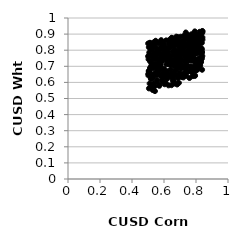
| Category | Series 0 |
|---|---|
| 0.789537141163253 | 0.861 |
| 0.7393209278989524 | 0.7 |
| 0.5146972384262045 | 0.762 |
| 0.8025821466182872 | 0.841 |
| 0.7553423103545773 | 0.827 |
| 0.6518374552992151 | 0.646 |
| 0.716653761533334 | 0.699 |
| 0.7913280189907017 | 0.906 |
| 0.5979593884945443 | 0.631 |
| 0.6924302068703907 | 0.749 |
| 0.6721062809417795 | 0.793 |
| 0.6343633907560136 | 0.862 |
| 0.7126194483507063 | 0.802 |
| 0.5954020792871302 | 0.768 |
| 0.7838053251334289 | 0.744 |
| 0.5831548302153797 | 0.768 |
| 0.6665365841519753 | 0.846 |
| 0.5408568572932027 | 0.755 |
| 0.7822607365205054 | 0.853 |
| 0.5972532858750963 | 0.798 |
| 0.5687135410672672 | 0.747 |
| 0.8086954234759687 | 0.823 |
| 0.6833786474103468 | 0.787 |
| 0.575823483311674 | 0.677 |
| 0.7512775900678096 | 0.874 |
| 0.5157013543859263 | 0.822 |
| 0.6257720732143637 | 0.787 |
| 0.6489855045192885 | 0.66 |
| 0.6496880024415178 | 0.652 |
| 0.643625241038317 | 0.766 |
| 0.8337201559222865 | 0.802 |
| 0.7409492055369735 | 0.871 |
| 0.6217054554742861 | 0.669 |
| 0.7963768174862137 | 0.865 |
| 0.7535535987557852 | 0.76 |
| 0.6586420130550489 | 0.625 |
| 0.807680028695077 | 0.882 |
| 0.7996050523855961 | 0.676 |
| 0.5791963725857388 | 0.709 |
| 0.7899514284050327 | 0.823 |
| 0.6170863241183342 | 0.794 |
| 0.696999464018413 | 0.757 |
| 0.8108554417359185 | 0.829 |
| 0.5592521472254736 | 0.788 |
| 0.673407103201527 | 0.756 |
| 0.6364854366401308 | 0.713 |
| 0.8019023742772847 | 0.889 |
| 0.7017172402778769 | 0.762 |
| 0.682590820111384 | 0.859 |
| 0.8255507794949901 | 0.718 |
| 0.7270235156668525 | 0.863 |
| 0.5835508032848437 | 0.729 |
| 0.5480344765651697 | 0.776 |
| 0.590976132361733 | 0.851 |
| 0.5080178996267478 | 0.785 |
| 0.5213319708328319 | 0.726 |
| 0.5585170846697625 | 0.807 |
| 0.727219435900885 | 0.771 |
| 0.8247338158405075 | 0.855 |
| 0.6407434502436964 | 0.816 |
| 0.7399629861713787 | 0.728 |
| 0.8203378696219645 | 0.845 |
| 0.5749204074095717 | 0.741 |
| 0.6471009726955761 | 0.583 |
| 0.5258403186809127 | 0.585 |
| 0.6884872854444603 | 0.834 |
| 0.7778725840772602 | 0.883 |
| 0.7719403527171453 | 0.762 |
| 0.7857166333493164 | 0.742 |
| 0.6579228734268394 | 0.634 |
| 0.7614068246514567 | 0.867 |
| 0.6230047715944955 | 0.636 |
| 0.7730864565297618 | 0.812 |
| 0.7591578467960547 | 0.627 |
| 0.6450855435140814 | 0.73 |
| 0.6286691533007386 | 0.748 |
| 0.747986817526133 | 0.739 |
| 0.7959635419356264 | 0.853 |
| 0.5195048153118826 | 0.7 |
| 0.5660370532559245 | 0.736 |
| 0.5093421625427896 | 0.669 |
| 0.7877308143223478 | 0.886 |
| 0.5674634064427115 | 0.797 |
| 0.5613703026136772 | 0.713 |
| 0.5719420304504657 | 0.845 |
| 0.5675779671727499 | 0.65 |
| 0.8322778754209412 | 0.883 |
| 0.5765796773158051 | 0.691 |
| 0.6253366417877969 | 0.749 |
| 0.7154265294037168 | 0.797 |
| 0.5016962133848333 | 0.653 |
| 0.7712719926138032 | 0.899 |
| 0.7572323442549609 | 0.764 |
| 0.8345911046278203 | 0.805 |
| 0.5860378547236758 | 0.777 |
| 0.8224486327946388 | 0.914 |
| 0.6418075506634328 | 0.681 |
| 0.724220812300675 | 0.775 |
| 0.6787454511188613 | 0.731 |
| 0.7333125306797498 | 0.74 |
| 0.5228472771427579 | 0.637 |
| 0.6760243627180262 | 0.794 |
| 0.543372627101915 | 0.546 |
| 0.7576616174536694 | 0.889 |
| 0.713827252726047 | 0.857 |
| 0.6300923187554525 | 0.84 |
| 0.7904861337532192 | 0.819 |
| 0.7247234132525657 | 0.783 |
| 0.6359512200970323 | 0.767 |
| 0.5555859263387691 | 0.605 |
| 0.6768518473513807 | 0.884 |
| 0.7632916115194517 | 0.77 |
| 0.8361713561107815 | 0.791 |
| 0.7186095118210329 | 0.839 |
| 0.7826198001580864 | 0.9 |
| 0.5738240237371401 | 0.771 |
| 0.522229076433828 | 0.579 |
| 0.7436753682812365 | 0.773 |
| 0.5694467603981398 | 0.711 |
| 0.5233217223801523 | 0.711 |
| 0.6055794496710558 | 0.795 |
| 0.8259875826886454 | 0.705 |
| 0.5546883763017978 | 0.799 |
| 0.6970743407092577 | 0.658 |
| 0.7566165155017609 | 0.797 |
| 0.7992659975486164 | 0.816 |
| 0.7196651382184569 | 0.817 |
| 0.8271957800808887 | 0.865 |
| 0.6426070367800769 | 0.647 |
| 0.6394822772287416 | 0.647 |
| 0.7626421155655152 | 0.694 |
| 0.734411382934531 | 0.823 |
| 0.5534244408105516 | 0.684 |
| 0.8281919239707146 | 0.726 |
| 0.7088443723876972 | 0.739 |
| 0.8199861684290868 | 0.743 |
| 0.6401429103923447 | 0.758 |
| 0.7025045353921959 | 0.821 |
| 0.746728014880554 | 0.896 |
| 0.7581663571935776 | 0.846 |
| 0.7507911358505414 | 0.862 |
| 0.6372755305705395 | 0.857 |
| 0.7173810607794494 | 0.701 |
| 0.7935086587236646 | 0.727 |
| 0.7149317985403314 | 0.812 |
| 0.6154269675054836 | 0.713 |
| 0.7361277163643768 | 0.91 |
| 0.6131144084233837 | 0.861 |
| 0.5302334103463762 | 0.646 |
| 0.6282488273001341 | 0.582 |
| 0.6099894606985351 | 0.768 |
| 0.5708010144974307 | 0.579 |
| 0.5125394888278862 | 0.69 |
| 0.7178824865773556 | 0.792 |
| 0.6449624632456418 | 0.638 |
| 0.677701555558522 | 0.79 |
| 0.7886346470031298 | 0.821 |
| 0.501015685375253 | 0.842 |
| 0.7659417452105861 | 0.866 |
| 0.8004567309422825 | 0.847 |
| 0.5043896243421815 | 0.671 |
| 0.7761600594016458 | 0.771 |
| 0.6982249758776872 | 0.695 |
| 0.7770443676625121 | 0.763 |
| 0.5823176648096522 | 0.862 |
| 0.5293232185321834 | 0.553 |
| 0.6623106509693579 | 0.605 |
| 0.8365377168351142 | 0.846 |
| 0.5500247197642468 | 0.643 |
| 0.8404298894487359 | 0.865 |
| 0.8302343059578688 | 0.746 |
| 0.7280562744120243 | 0.766 |
| 0.7052163806409246 | 0.847 |
| 0.5883584156752549 | 0.762 |
| 0.814812190026081 | 0.711 |
| 0.7849867627304555 | 0.852 |
| 0.5396863462382026 | 0.771 |
| 0.6609840372955875 | 0.659 |
| 0.7225769808817138 | 0.888 |
| 0.6615694642950851 | 0.742 |
| 0.7804333124404206 | 0.639 |
| 0.6707992627941833 | 0.843 |
| 0.5102409027126322 | 0.593 |
| 0.7690451302396976 | 0.889 |
| 0.7619484803774603 | 0.751 |
| 0.6378902395056195 | 0.826 |
| 0.5511583664545938 | 0.713 |
| 0.6271628713404449 | 0.816 |
| 0.7670833033895674 | 0.882 |
| 0.7300021073221883 | 0.761 |
| 0.6046075290501778 | 0.769 |
| 0.5702450708924186 | 0.584 |
| 0.5722356065049252 | 0.678 |
| 0.5134334107048619 | 0.73 |
| 0.5810489904550544 | 0.743 |
| 0.6384709155846835 | 0.636 |
| 0.6186296199921117 | 0.622 |
| 0.7832609581420303 | 0.672 |
| 0.7989352083779209 | 0.778 |
| 0.812688064621234 | 0.869 |
| 0.7650897692764829 | 0.697 |
| 0.6068793432318736 | 0.639 |
| 0.7498929052159753 | 0.864 |
| 0.6120349753517347 | 0.811 |
| 0.5169431667872195 | 0.802 |
| 0.5420872220308097 | 0.657 |
| 0.6235870093073029 | 0.741 |
| 0.5422605610858657 | 0.576 |
| 0.7260380441251993 | 0.887 |
| 0.7116958134653328 | 0.651 |
| 0.5077893646532936 | 0.665 |
| 0.767893875161042 | 0.677 |
| 0.650373331584239 | 0.876 |
| 0.598786939241255 | 0.821 |
| 0.695608895007974 | 0.801 |
| 0.82535017237486 | 0.864 |
| 0.5104788671468552 | 0.772 |
| 0.7320293709174297 | 0.755 |
| 0.6269588786217475 | 0.713 |
| 0.593083062892082 | 0.85 |
| 0.5350707556940748 | 0.593 |
| 0.6294453702593112 | 0.858 |
| 0.7040968136256662 | 0.747 |
| 0.6533779649164462 | 0.839 |
| 0.7942106823003154 | 0.641 |
| 0.811901963147115 | 0.873 |
| 0.7104740438861703 | 0.823 |
| 0.693133057427636 | 0.597 |
| 0.7921355056519706 | 0.642 |
| 0.6892237066591924 | 0.828 |
| 0.7004566094279603 | 0.701 |
| 0.5308072251341074 | 0.688 |
| 0.5878246704918391 | 0.616 |
| 0.7457421732222543 | 0.793 |
| 0.6875049544639892 | 0.627 |
| 0.6015842296174445 | 0.835 |
| 0.5610861855862372 | 0.654 |
| 0.5486175619525406 | 0.854 |
| 0.8307150512817066 | 0.883 |
| 0.7889646714209345 | 0.79 |
| 0.5898890208474401 | 0.816 |
| 0.7682190639148487 | 0.873 |
| 0.5206159518238059 | 0.811 |
| 0.5944197797454747 | 0.605 |
| 0.5769503188403247 | 0.643 |
| 0.5443798624577283 | 0.769 |
| 0.5387178807052888 | 0.715 |
| 0.6572891983003302 | 0.618 |
| 0.505137078765321 | 0.819 |
| 0.5024680753734336 | 0.643 |
| 0.7415167907407327 | 0.792 |
| 0.6914305278073793 | 0.633 |
| 0.534198398019456 | 0.819 |
| 0.6204361340329394 | 0.664 |
| 0.8288236153589748 | 0.752 |
| 0.7369203330463815 | 0.681 |
| 0.538099366126239 | 0.851 |
| 0.8011450774957143 | 0.716 |
| 0.8105242713615359 | 0.881 |
| 0.7292228330643074 | 0.816 |
| 0.8358139794247456 | 0.788 |
| 0.816563368010178 | 0.811 |
| 0.580207523896829 | 0.818 |
| 0.6316776881528324 | 0.862 |
| 0.5371866346769926 | 0.697 |
| 0.6687148511904183 | 0.719 |
| 0.6567939707349895 | 0.843 |
| 0.7209976358971026 | 0.843 |
| 0.7135983798827182 | 0.837 |
| 0.7696541728498524 | 0.85 |
| 0.7157272758945765 | 0.801 |
| 0.6172562919259493 | 0.738 |
| 0.5263219179213916 | 0.841 |
| 0.7813322103951235 | 0.691 |
| 0.8034618510051994 | 0.858 |
| 0.6135469142534808 | 0.667 |
| 0.7101028762311821 | 0.84 |
| 0.8082577811232756 | 0.886 |
| 0.7930110556401346 | 0.688 |
| 0.8315888311006657 | 0.726 |
| 0.5531132017462612 | 0.746 |
| 0.5640164770073358 | 0.697 |
| 0.740755864883649 | 0.737 |
| 0.8138927524118643 | 0.885 |
| 0.5965798767691801 | 0.784 |
| 0.6905536117521336 | 0.648 |
| 0.6989193945286931 | 0.812 |
| 0.6782873171751561 | 0.868 |
| 0.5887587360960318 | 0.812 |
| 0.545096536696138 | 0.755 |
| 0.5181168736858328 | 0.634 |
| 0.5563498425888556 | 0.841 |
| 0.7948384877299103 | 0.83 |
| 0.6485331080822354 | 0.71 |
| 0.707040865868648 | 0.78 |
| 0.6723104222854052 | 0.77 |
| 0.7308092922984819 | 0.731 |
| 0.5277218957704807 | 0.8 |
| 0.8299161022661221 | 0.907 |
| 0.5311810440695621 | 0.626 |
| 0.6162599047138804 | 0.816 |
| 0.7326922975353685 | 0.825 |
| 0.6812268205595059 | 0.862 |
| 0.6798712123164434 | 0.696 |
| 0.5184395433749904 | 0.621 |
| 0.820841176408082 | 0.72 |
| 0.8188985142541382 | 0.786 |
| 0.8396653941332525 | 0.764 |
| 0.8171376598364926 | 0.781 |
| 0.8132403407792173 | 0.746 |
| 0.7559537005015777 | 0.736 |
| 0.7064923509611757 | 0.769 |
| 0.6515978628646515 | 0.842 |
| 0.619877284833922 | 0.73 |
| 0.5116384102169871 | 0.846 |
| 0.5138558575832506 | 0.844 |
| 0.72195636492609 | 0.856 |
| 0.7983077541737953 | 0.676 |
| 0.8401326443252485 | 0.879 |
| 0.6021195898072189 | 0.67 |
| 0.5239760149762042 | 0.737 |
| 0.7722807887619956 | 0.734 |
| 0.7232868499769498 | 0.691 |
| 0.6240934413111874 | 0.807 |
| 0.5797529875715566 | 0.808 |
| 0.7337505091867687 | 0.71 |
| 0.5345826574834631 | 0.573 |
| 0.8231493107431219 | 0.704 |
| 0.760874810361585 | 0.782 |
| 0.7518745549436666 | 0.836 |
| 0.7037596612497005 | 0.884 |
| 0.8371061056063369 | 0.748 |
| 0.5005654408318474 | 0.762 |
| 0.6600261468371134 | 0.823 |
| 0.6655703554853698 | 0.593 |
| 0.6188464155712632 | 0.76 |
| 0.7213733608617222 | 0.631 |
| 0.8376254118775233 | 0.785 |
| 0.8290088863347889 | 0.905 |
| 0.6866084537307862 | 0.642 |
| 0.655859259045968 | 0.61 |
| 0.6028599353701174 | 0.751 |
| 0.5778004885046151 | 0.693 |
| 0.8149097894305937 | 0.738 |
| 0.5035709114777457 | 0.743 |
| 0.8070455716759641 | 0.72 |
| 0.8343825575344785 | 0.807 |
| 0.6803238877647404 | 0.643 |
| 0.7595134728547416 | 0.698 |
| 0.550274464401461 | 0.745 |
| 0.6217501567726843 | 0.788 |
| 0.6461457087190123 | 0.736 |
| 0.6348514102882601 | 0.836 |
| 0.6084930386406241 | 0.648 |
| 0.8192868320233158 | 0.887 |
| 0.7783480602052675 | 0.802 |
| 0.6113945756898719 | 0.665 |
| 0.6943933388688436 | 0.696 |
| 0.6529179606617319 | 0.793 |
| 0.6056979474012236 | 0.79 |
| 0.6848714705276597 | 0.882 |
| 0.8015582336093101 | 0.803 |
| 0.7289067495823759 | 0.658 |
| 0.5622284064939066 | 0.705 |
| 0.7702812009293001 | 0.748 |
| 0.8033983214234028 | 0.716 |
| 0.6107656759838829 | 0.595 |
| 0.7057501357201889 | 0.686 |
| 0.5645974943306735 | 0.714 |
| 0.7491960113879528 | 0.796 |
| 0.6917449551751924 | 0.844 |
| 0.8276715674720829 | 0.874 |
| 0.764799815398711 | 0.745 |
| 0.6433917746198824 | 0.71 |
| 0.8325839292006654 | 0.907 |
| 0.5957830175324024 | 0.837 |
| 0.6755465129170561 | 0.753 |
| 0.7862526788101084 | 0.751 |
| 0.8055068218552915 | 0.719 |
| 0.5934660374426435 | 0.654 |
| 0.7796131888918132 | 0.873 |
| 0.6744980171013388 | 0.843 |
| 0.6682844089184725 | 0.833 |
| 0.8040624721982079 | 0.675 |
| 0.5730330248982907 | 0.848 |
| 0.663483374175547 | 0.844 |
| 0.8221742857258698 | 0.901 |
| 0.5476056374957843 | 0.859 |
| 0.7754581525567357 | 0.851 |
| 0.8392207373883781 | 0.919 |
| 0.8094765911449644 | 0.847 |
| 0.5922345049980708 | 0.846 |
| 0.6474579633067048 | 0.877 |
| 0.7768302206504119 | 0.838 |
| 0.7544998921006918 | 0.741 |
| 0.786887759064523 | 0.793 |
| 0.7640462771385799 | 0.821 |
| 0.5165512430964073 | 0.64 |
| 0.5360847798916163 | 0.783 |
| 0.7807273047009422 | 0.76 |
| 0.7749783103177902 | 0.852 |
| 0.8331184289387845 | 0.864 |
| 0.6549505387521527 | 0.733 |
| 0.8350421778859363 | 0.811 |
| 0.6859579806184146 | 0.778 |
| 0.7663724314223361 | 0.887 |
| 0.8177862941701423 | 0.719 |
| 0.7540287822068092 | 0.777 |
| 0.7200405575950605 | 0.797 |
| 0.667676076606502 | 0.714 |
| 0.552387216111887 | 0.765 |
| 0.7442838691388534 | 0.705 |
| 0.604081285321407 | 0.588 |
| 0.608928945576837 | 0.795 |
| 0.7385924061333593 | 0.832 |
| 0.8238578367821685 | 0.807 |
| 0.7255112937219836 | 0.815 |
| 0.792575670625725 | 0.917 |
| 0.821348189171077 | 0.845 |
| 0.6649120072510374 | 0.727 |
| 0.8046421024533167 | 0.79 |
| 0.5065103618331985 | 0.671 |
| 0.6960898931023682 | 0.726 |
| 0.7474115934583401 | 0.789 |
| 0.5467928323819594 | 0.743 |
| 0.6818868608789497 | 0.587 |
| 0.5253352901702142 | 0.772 |
| 0.773883473217598 | 0.662 |
| 0.7603668213685014 | 0.873 |
| 0.7967468101681756 | 0.703 |
| 0.6705602813345477 | 0.861 |
| 0.6309182357433218 | 0.643 |
| 0.8310479566002458 | 0.742 |
| 0.6325658895445669 | 0.753 |
| 0.8266888472407585 | 0.844 |
| 0.7006261887138281 | 0.837 |
| 0.7842778855332349 | 0.693 |
| 0.6659732911961607 | 0.806 |
| 0.6693854136913613 | 0.67 |
| 0.6994968517177692 | 0.721 |
| 0.7978472162532757 | 0.891 |
| 0.7374869270186959 | 0.641 |
| 0.8164663854506397 | 0.814 |
| 0.6896129679642443 | 0.719 |
| 0.5579749556458715 | 0.614 |
| 0.8056581221452149 | 0.739 |
| 0.7873914650139319 | 0.844 |
| 0.7793454863912508 | 0.697 |
| 0.6334950040387688 | 0.718 |
| 0.5320665774426665 | 0.707 |
| 0.5597604347093685 | 0.672 |
| 0.6936607614974919 | 0.772 |
| 0.5058655571533703 | 0.563 |
| 0.7493934186874354 | 0.666 |
| 0.8387690499716574 | 0.908 |
| 0.5840419248153067 | 0.639 |
| 0.8157624935827636 | 0.813 |
| 0.6541272166461876 | 0.769 |
| 0.6641038199385962 | 0.699 |
| 0.7744218546165372 | 0.751 |
| 0.7030388593112695 | 0.847 |
| 0.5402943534428464 | 0.836 |
| 0.607506174513098 | 0.813 |
| 0.6140948824893664 | 0.78 |
| 0.6853888022552872 | 0.862 |
| 0.5328351599906361 | 0.835 |
| 0.8410056060395921 | 0.916 |
| 0.7353356687600429 | 0.781 |
| 0.7428454406025613 | 0.833 |
| 0.6003997663573484 | 0.749 |
| 0.5864733424346917 | 0.732 |
| 0.8184514977683318 | 0.845 |
| 0.6594015734738186 | 0.867 |
| 0.8234092256734673 | 0.883 |
| 0.746220387298123 | 0.698 |
| 0.744791945930634 | 0.871 |
| 0.6002483614717703 | 0.685 |
| 0.7085156453134214 | 0.839 |
| 0.6839079493313234 | 0.685 |
| 0.7706952622317517 | 0.809 |
| 0.5281190398108249 | 0.742 |
| 0.5570222706826367 | 0.798 |
| 0.5653082994213927 | 0.715 |
| 0.5460084718126278 | 0.816 |
| 0.7317011980613475 | 0.845 |
| 0.7076990167473598 | 0.712 |
| 0.8114551726119582 | 0.895 |
| 0.7422622255618085 | 0.894 |
| 0.7382118330031835 | 0.764 |
| 0.7111180119437281 | 0.633 |
| 0.8062313878890663 | 0.699 |
| 0.674135390663121 | 0.677 |
| 0.8096214170149771 | 0.891 |
| 0.5852921103066097 | 0.807 |
| 0.5906997642665537 | 0.605 |
| 0.8381530388490658 | 0.678 |
| 0.7528427078964053 | 0.814 |
| 0.8133816512580974 | 0.685 |
| 0.7954787818687489 | 0.903 |
| 0.5634001675840955 | 0.785 |